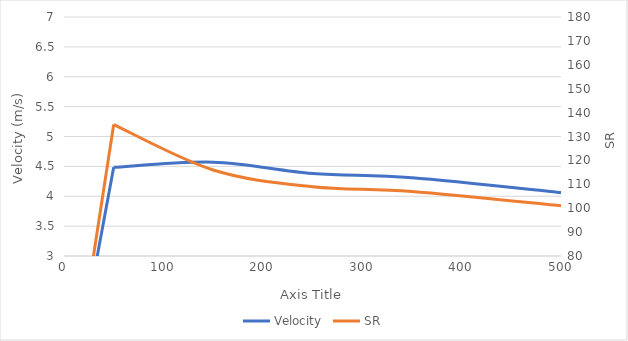
| Category | Velocity |
|---|---|
| 0.0 | 0 |
| 50.0 | 4.484 |
| 150.0 | 4.57 |
| 250.0 | 4.382 |
| 350.0 | 4.308 |
| 500.0 | 4.062 |